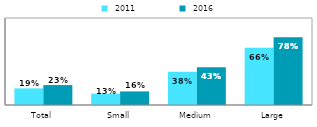
| Category |  2011 |  2016 |
|---|---|---|
| Total | 0.191 | 0.229 |
| Small | 0.13 | 0.156 |
| Medium | 0.383 | 0.434 |
| Large | 0.658 | 0.779 |